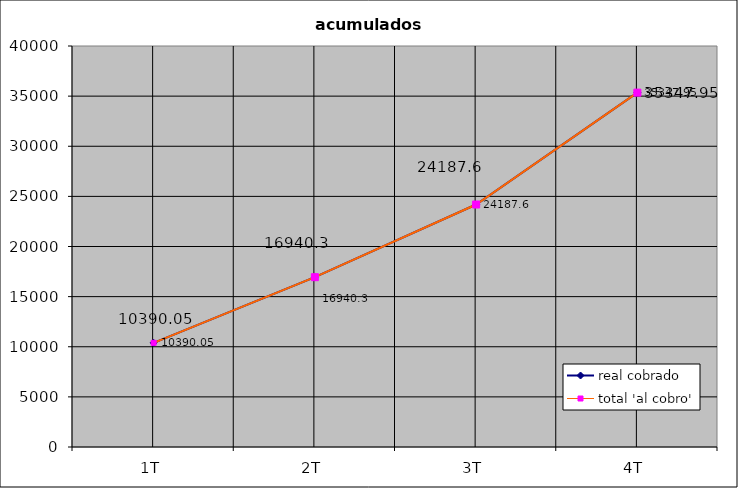
| Category | real cobrado | total 'al cobro' |
|---|---|---|
| 1T | 10390.05 | 10390.05 |
| 2T | 16940.3 | 16940.3 |
| 3T | 24187.6 | 24187.6 |
| 4T | 35347.95 | 35347.95 |